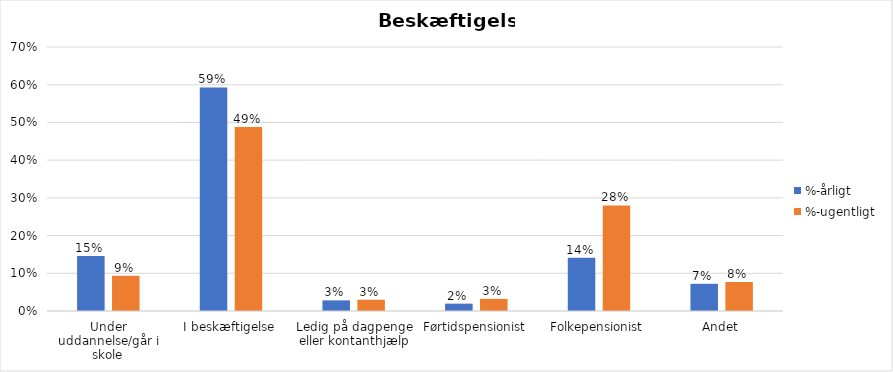
| Category | %-årligt | %-ugentligt |
|---|---|---|
| Under uddannelse/går i skole | 0.146 | 0.093 |
| I beskæftigelse | 0.593 | 0.488 |
| Ledig på dagpenge eller kontanthjælp | 0.028 | 0.03 |
| Førtidspensionist | 0.019 | 0.032 |
| Folkepensionist | 0.142 | 0.28 |
| Andet | 0.072 | 0.077 |